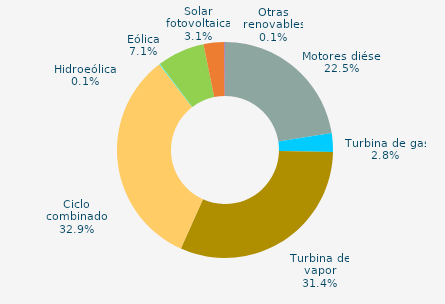
| Category | Series 0 |
|---|---|
| Motores diésel | 22.5 |
| Turbina de gas | 2.8 |
| Turbina de vapor | 31.4 |
| Ciclo combinado | 32.9 |
| Cogeneración | 0 |
| Hidráulica | 0 |
| Hidroeólica | 0.1 |
| Eólica | 7.1 |
| Solar fotovoltaica | 3.1 |
| Otras renovables | 0.1 |